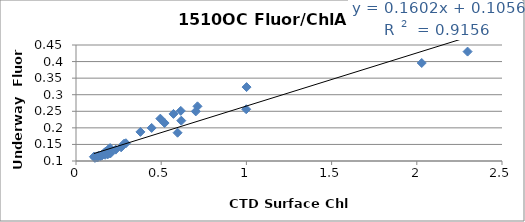
| Category | Series 0 |
|---|---|
| 0.596 | 0.185 |
| 0.378 | 0.188 |
| 0.145 | 0.115 |
| 0.171 | 0.119 |
| 0.202 | 0.123 |
| 0.174 | 0.127 |
| 0.184 | 0.124 |
| 0.11 | 0.112 |
| 0.129 | 0.112 |
| 0.124 | 0.111 |
| 0.167 | 0.125 |
| 0.133 | 0.116 |
| 0.171 | 0.126 |
| 0.151 | 0.118 |
| 0.155 | 0.119 |
| 0.444 | 0.2 |
| 0.52 | 0.215 |
| 0.618 | 0.222 |
| 0.265 | 0.141 |
| 0.2 | 0.139 |
| 0.999 | 0.256 |
| 0.713 | 0.265 |
| 0.572 | 0.242 |
| 1.001 | 0.323 |
| 0.495 | 0.228 |
| 0.154 | 0.118 |
| 0.191 | 0.135 |
| 0.703 | 0.25 |
| 2.029 | 0.396 |
| 2.298 | 0.43 |
| 0.293 | 0.154 |
| 0.282 | 0.152 |
| 0.233 | 0.134 |
| 0.175 | 0.129 |
| 0.121 | 0.114 |
| 0.111 | 0.109 |
| 0.105 | 0.113 |
| 0.195 | 0.124 |
| 0.186 | 0.12 |
| 0.615 | 0.251 |
| 0.162 | 0.12 |